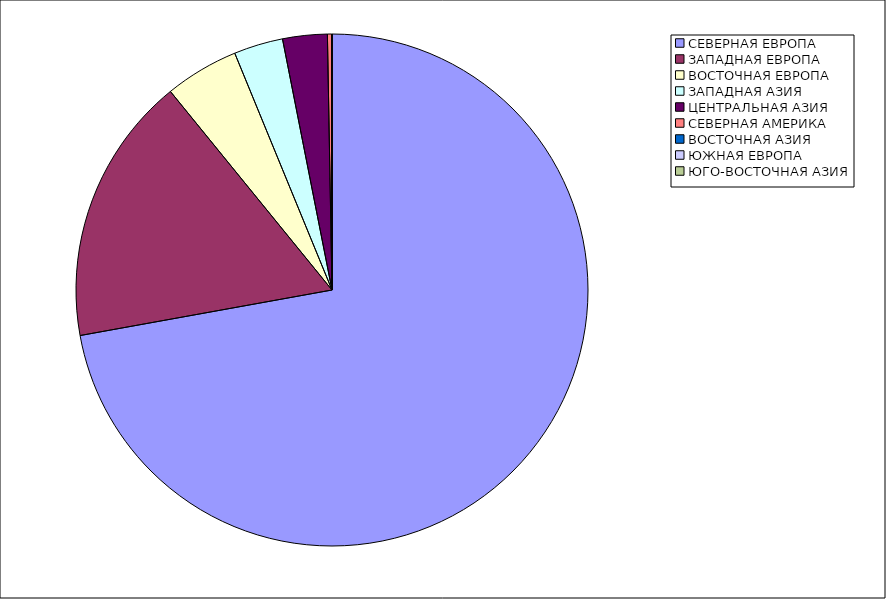
| Category | Оборот |
|---|---|
| СЕВЕРНАЯ ЕВРОПА | 72.153 |
| ЗАПАДНАЯ ЕВРОПА | 16.974 |
| ВОСТОЧНАЯ ЕВРОПА | 4.671 |
| ЗАПАДНАЯ АЗИЯ | 3.103 |
| ЦЕНТРАЛЬНАЯ АЗИЯ | 2.813 |
| СЕВЕРНАЯ АМЕРИКА | 0.257 |
| ВОСТОЧНАЯ АЗИЯ | 0.027 |
| ЮЖНАЯ ЕВРОПА | 0.002 |
| ЮГО-ВОСТОЧНАЯ АЗИЯ | 0 |